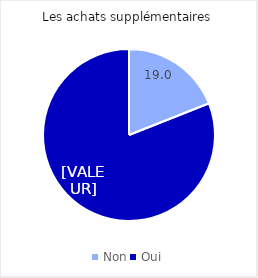
| Category | Series 0 |
|---|---|
| Non | 19 |
| Oui | 81 |